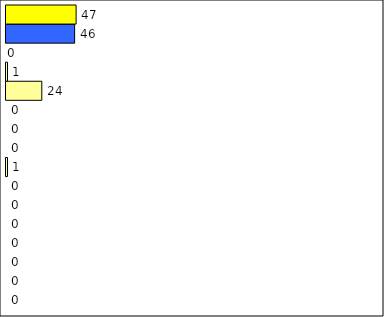
| Category | -2 | -1 | 0 | 1 | 2 | 3 | 4 | 5 | 6 | 7 | 8 | 9 | 10 | 11 | 12 | Perfect Round |
|---|---|---|---|---|---|---|---|---|---|---|---|---|---|---|---|---|
| 0 | 0 | 0 | 0 | 0 | 0 | 0 | 0 | 1 | 0 | 0 | 0 | 24 | 1 | 0 | 46 | 47 |